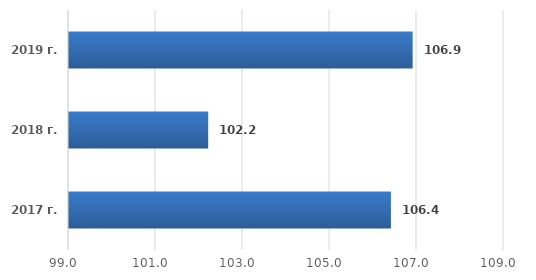
| Category | Series 0 |
|---|---|
| 2017 г. | 106.4 |
| 2018 г. | 102.2 |
| 2019 г. | 106.9 |